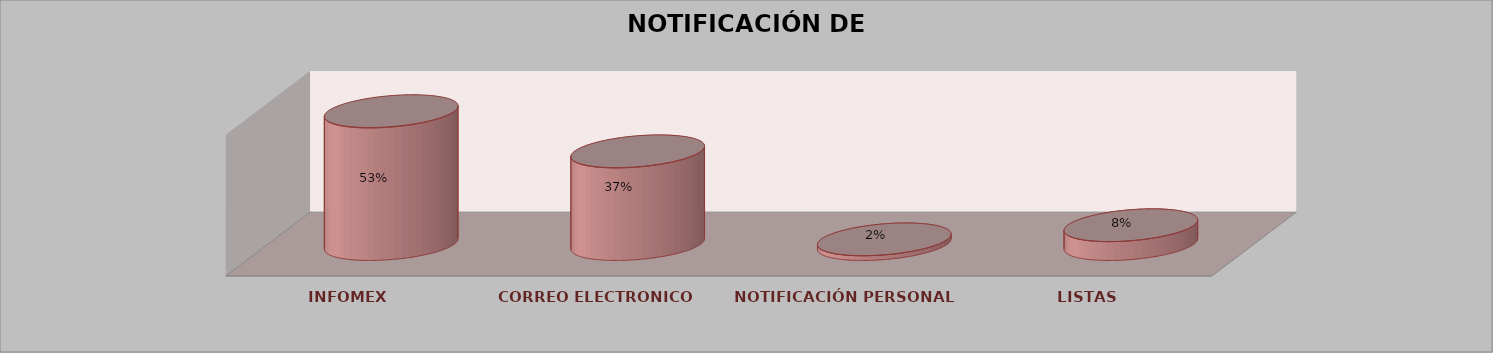
| Category | Series 0 | Series 1 | Series 2 | Series 3 | Series 4 |
|---|---|---|---|---|---|
| INFOMEX |  |  |  | 169 | 0.533 |
| CORREO ELECTRONICO |  |  |  | 118 | 0.372 |
| NOTIFICACIÓN PERSONAL |  |  |  | 6 | 0.019 |
| LISTAS |  |  |  | 24 | 0.076 |